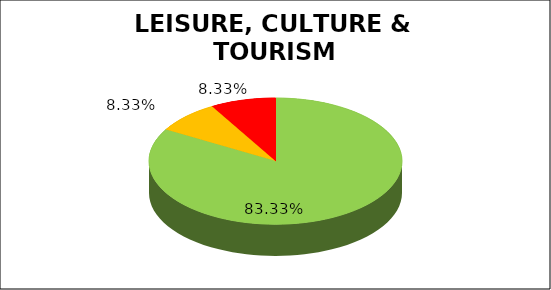
| Category | Q4 |
|---|---|
| Green | 0.833 |
| Amber | 0.083 |
| Red | 0.083 |